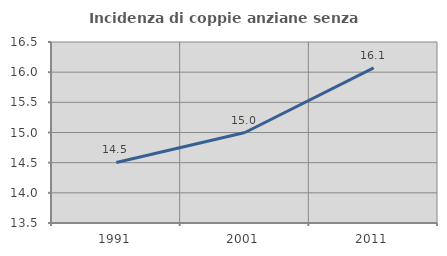
| Category | Incidenza di coppie anziane senza figli  |
|---|---|
| 1991.0 | 14.504 |
| 2001.0 | 15 |
| 2011.0 | 16.071 |